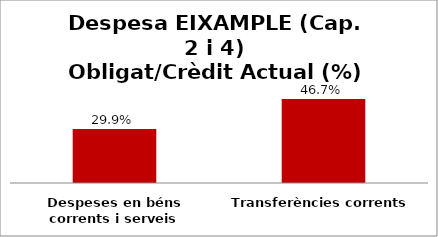
| Category | Series 0 |
|---|---|
| Despeses en béns corrents i serveis | 0.299 |
| Transferències corrents | 0.467 |